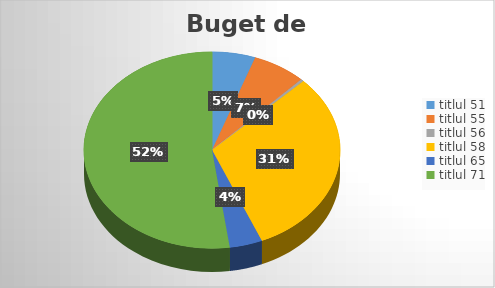
| Category | Series 0 |
|---|---|
| titlul 51 | 778888 |
| titlul 55 | 966487 |
| titlul 56 | 53913 |
| titlul 58 | 4427611 |
| titlul 65 | 588575 |
| titlul 71 | 7448175 |